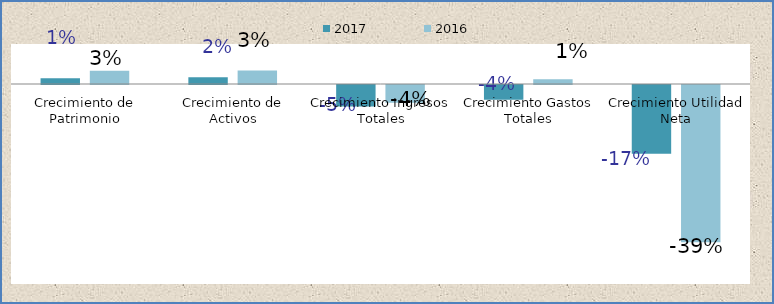
| Category | 2017 | 2016 |
|---|---|---|
| 0 | 0.014 | 0.033 |
| 1 | 0.017 | 0.034 |
| 2 | -0.054 | -0.044 |
| 3 | -0.037 | 0.012 |
| 4 | -0.172 | -0.393 |